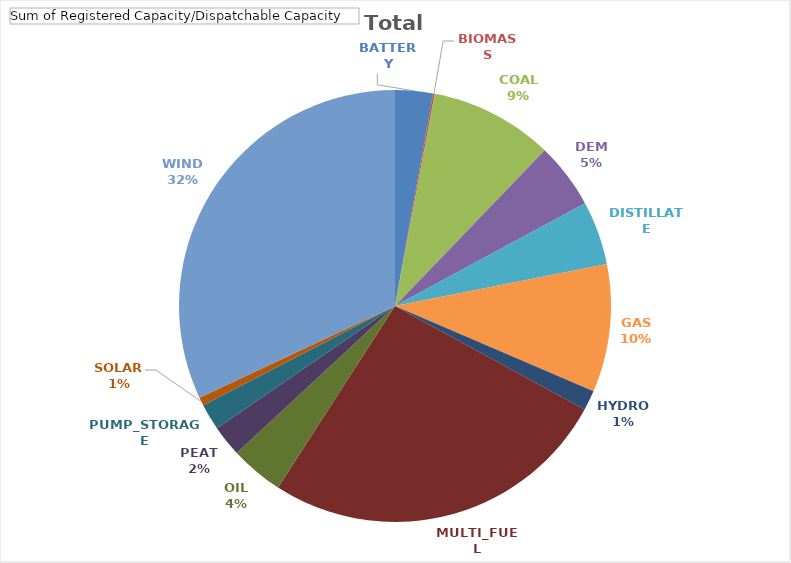
| Category | Total |
|---|---|
| BATTERY | 418.1 |
| BIOMASS | 18.85 |
| COAL | 1368.18 |
| DEM | 729.47 |
| DISTILLATE | 707.097 |
| GAS | 1419.105 |
| HYDRO | 221.258 |
| MULTI_FUEL | 3874.5 |
| OIL | 589.4 |
| PEAT | 346 |
| PUMP_STORAGE | 292 |
| SOLAR | 92.36 |
| WIND | 4737.827 |